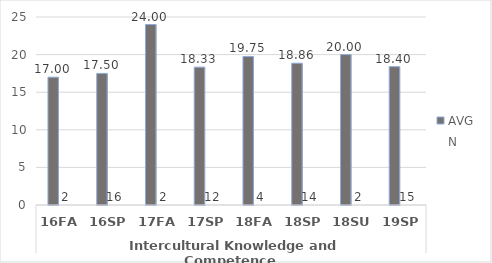
| Category | HS.AAS - AVG | HS.AAS - N |
|---|---|---|
| 0 | 17 | 2 |
| 1 | 17.5 | 16 |
| 2 | 24 | 2 |
| 3 | 18.333 | 12 |
| 4 | 19.75 | 4 |
| 5 | 18.857 | 14 |
| 6 | 20 | 2 |
| 7 | 18.4 | 15 |